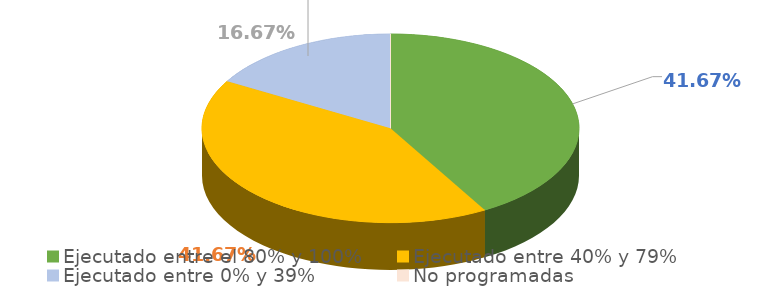
| Category | Series 0 |
|---|---|
| Ejecutado entre el 80% y 100% | 0.417 |
| Ejecutado entre 40% y 79% | 0.417 |
| Ejecutado entre 0% y 39% | 0.167 |
| No programadas | 0 |